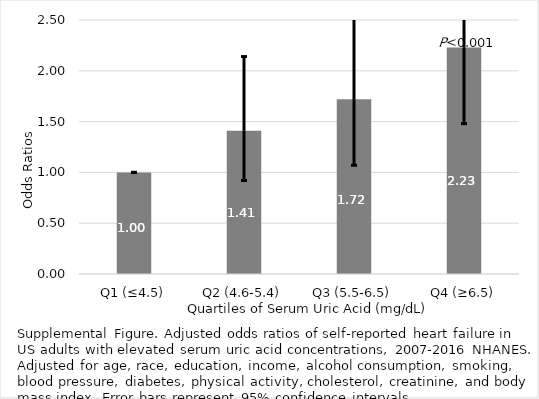
| Category | Series 0 |
|---|---|
| Q1 (≤4.5) | 1 |
| Q2 (4.6-5.4) | 1.41 |
| Q3 (5.5-6.5) | 1.72 |
| Q4 (≥6.5) | 2.23 |